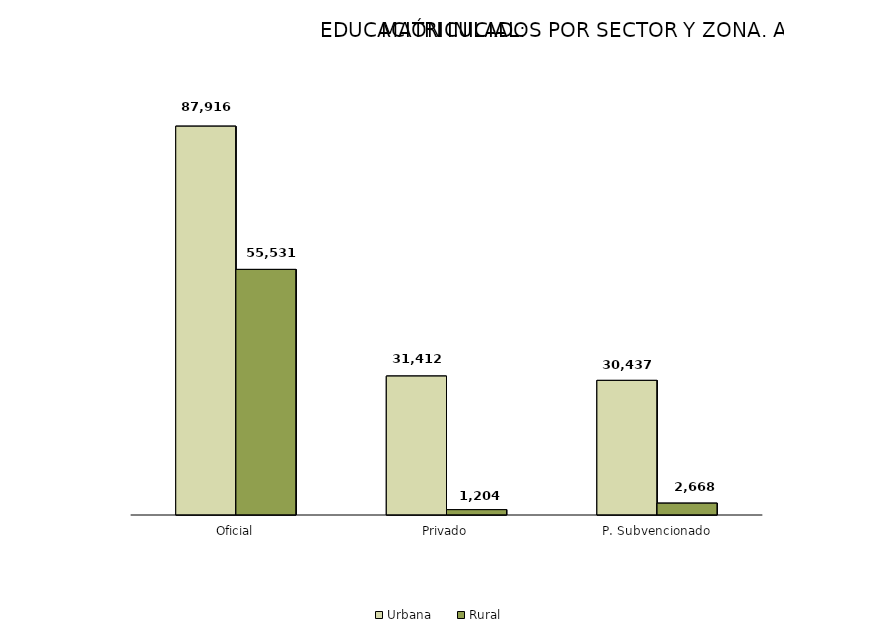
| Category | Urbana | Rural |
|---|---|---|
| Oficial | 87916 | 55531 |
| Privado | 31412 | 1204 |
| P. Subvencionado | 30437 | 2668 |